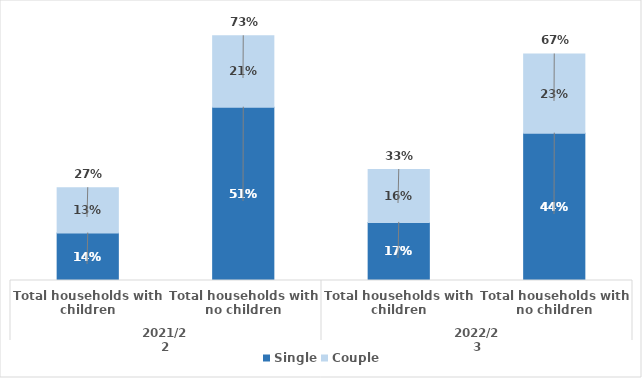
| Category | Single | Couple |
|---|---|---|
| 0 | 0.141 | 0.134 |
| 1 | 0.514 | 0.212 |
| 2 | 0.172 | 0.157 |
| 3 | 0.437 | 0.235 |